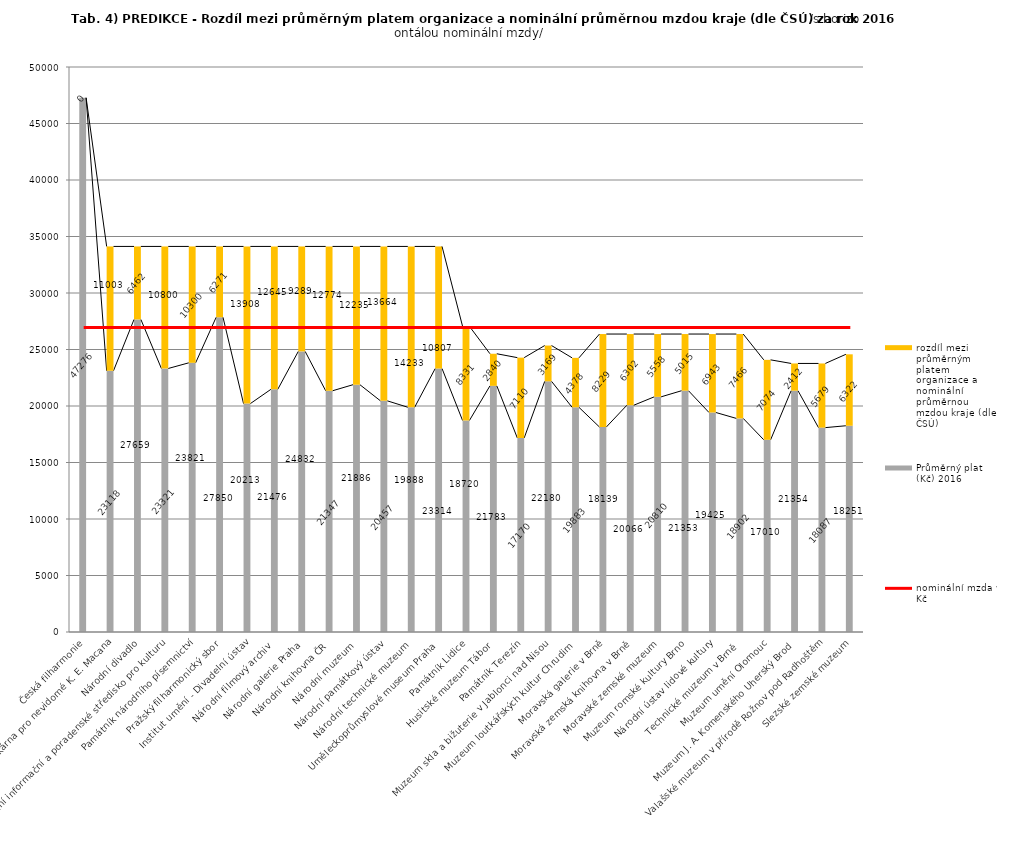
| Category | Průměrný plat (Kč) 2016 | rozdíl mezi průměrným platem organizace a nominální průměrnou mzdou kraje (dle ČSÚ) |
|---|---|---|
| Česká filharmonie | 47276 | 0 |
| Knihovna a tiskárna pro nevidomé K. E. Macana | 23118 | 11003 |
| Národní divadlo | 27659 | 6462 |
| Národní informační a poradenské středisko pro kulturu | 23321 | 10800 |
| Památník národního písemnictví | 23821 | 10300 |
| Pražský filharmonický sbor | 27850 | 6271 |
| Institut umění - Divadelní ústav | 20213 | 13908 |
| Národní filmový archiv | 21476 | 12645 |
| Národní galerie Praha | 24832 | 9289 |
| Národní knihovna ČR | 21347 | 12774 |
| Národní muzeum | 21886 | 12235 |
| Národní památkový ústav | 20457 | 13664 |
| Národní technické muzeum | 19888 | 14233 |
| Uměleckoprůmyslové museum Praha | 23314 | 10807 |
| Památník Lidice | 18720 | 8331 |
| Husitské muzeum Tábor | 21783 | 2840 |
| Památník Terezín | 17170 | 7110 |
| Muzeum skla a bižuterie v Jablonci nad Nisou | 22180 | 3169 |
| Muzeum loutkářských kultur Chrudim | 19883 | 4378 |
| Moravská galerie v Brně | 18139 | 8229 |
| Moravská zemská knihovna v Brně | 20066 | 6302 |
| Moravské zemské muzeum | 20810 | 5558 |
| Muzeum romské kultury Brno | 21353 | 5015 |
| Národní ústav lidové kultury | 19425 | 6943 |
| Technické muzeum v Brně  | 18902 | 7466 |
| Muzeum umění Olomouc | 17010 | 7074 |
| Muzeum J. A. Komenského Uherský Brod | 21354 | 2412 |
| Valašské muzeum v přírodě Rožnov pod Radhoštěm | 18087 | 5679 |
| Slezské zemské muzeum | 18251 | 6322 |